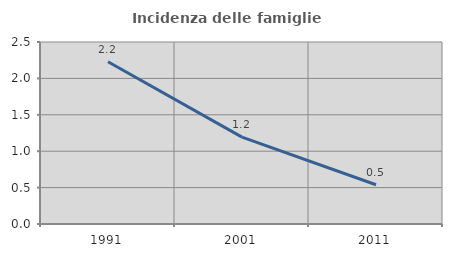
| Category | Incidenza delle famiglie numerose |
|---|---|
| 1991.0 | 2.228 |
| 2001.0 | 1.194 |
| 2011.0 | 0.539 |